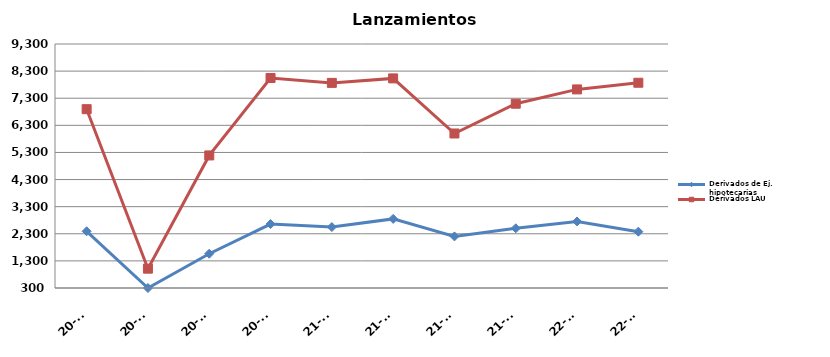
| Category | Derivados de Ej. hipotecarias | Derivados LAU |
|---|---|---|
| 20-T1 | 2392 | 6896 |
| 20-T2 | 300 | 1013 |
| 20-T3 | 1564 | 5190 |
| 20-T4 | 2659 | 8046 |
| 21-T1 | 2548 | 7866 |
| 21-T2 | 2849 | 8031 |
| 21-T3 | 2203 | 5999 |
| 21-T4 | 2503 | 7097 |
| 22-T1 | 2755 | 7625 |
| 22-T2 | 2377 | 7871 |